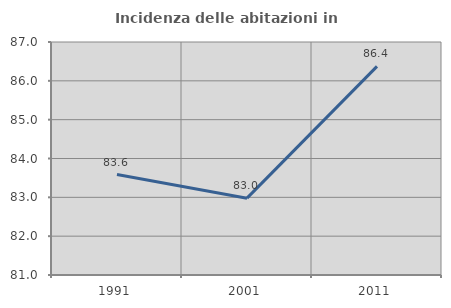
| Category | Incidenza delle abitazioni in proprietà  |
|---|---|
| 1991.0 | 83.588 |
| 2001.0 | 82.979 |
| 2011.0 | 86.372 |